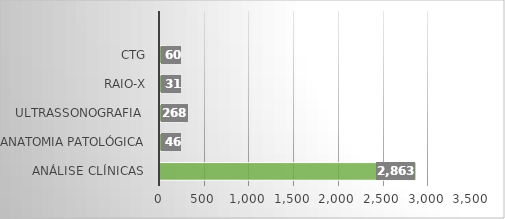
| Category | Series 0 |
|---|---|
| Análise Clínicas  | 2863 |
| Anatomia Patológica | 46 |
| Ultrassonografia  | 268 |
| RAIO-X | 31 |
| CTG | 60 |